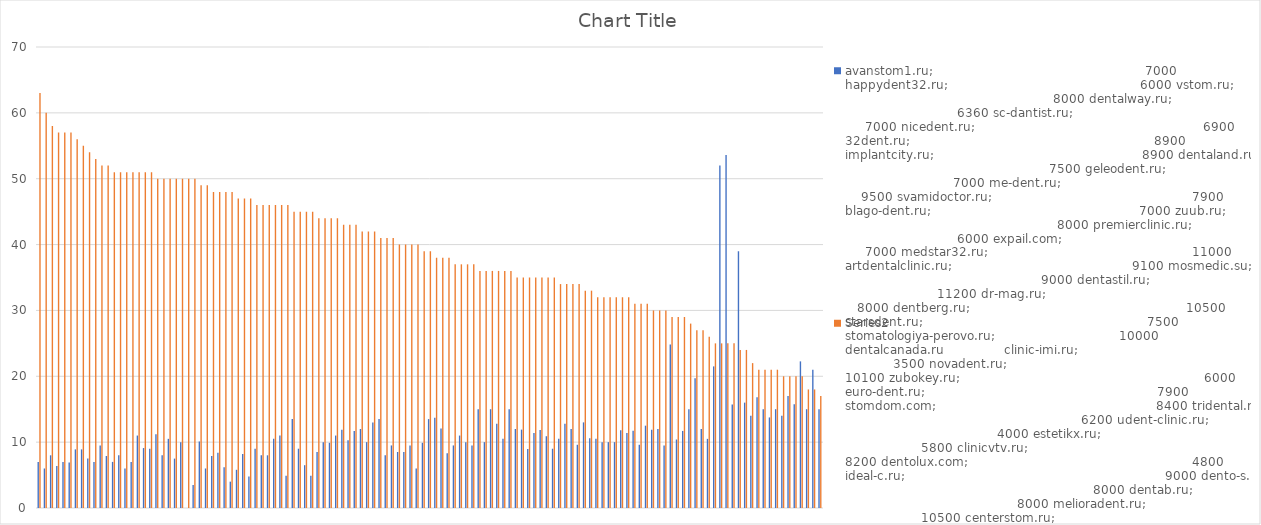
| Category | avanstom1.ru;                                                     7000 | Series 1 |
|---|---|---|
| 0 | 7 | 63 |
| 1 | 6 | 60 |
| 2 | 8 | 58 |
| 3 | 6.36 | 57 |
| 4 | 7 | 57 |
| 5 | 6.9 | 57 |
| 6 | 8.9 | 56 |
| 7 | 8.9 | 55 |
| 8 | 7.5 | 54 |
| 9 | 7 | 53 |
| 10 | 9.5 | 52 |
| 11 | 7.9 | 52 |
| 12 | 7 | 51 |
| 13 | 8 | 51 |
| 14 | 6 | 51 |
| 15 | 7 | 51 |
| 16 | 11 | 51 |
| 17 | 9.1 | 51 |
| 18 | 9 | 51 |
| 19 | 11.2 | 50 |
| 20 | 8 | 50 |
| 21 | 10.5 | 50 |
| 22 | 7.5 | 50 |
| 23 | 10 | 50 |
| 24 | 0 | 50 |
| 25 | 3.5 | 50 |
| 26 | 10.1 | 49 |
| 27 | 6 | 49 |
| 28 | 7.9 | 48 |
| 29 | 8.4 | 48 |
| 30 | 6.2 | 48 |
| 31 | 4 | 48 |
| 32 | 5.8 | 47 |
| 33 | 8.2 | 47 |
| 34 | 4.8 | 47 |
| 35 | 9 | 46 |
| 36 | 8 | 46 |
| 37 | 8 | 46 |
| 38 | 10.5 | 46 |
| 39 | 11 | 46 |
| 40 | 4.9 | 46 |
| 41 | 13.5 | 45 |
| 42 | 9 | 45 |
| 43 | 6.5 | 45 |
| 44 | 4.9 | 45 |
| 45 | 8.5 | 44 |
| 46 | 10 | 44 |
| 47 | 9.9 | 44 |
| 48 | 11 | 44 |
| 49 | 11.9 | 43 |
| 50 | 10.3 | 43 |
| 51 | 11.7 | 43 |
| 52 | 12 | 42 |
| 53 | 10 | 42 |
| 54 | 13 | 42 |
| 55 | 13.5 | 41 |
| 56 | 8 | 41 |
| 57 | 9.5 | 41 |
| 58 | 8.5 | 40 |
| 59 | 8.5 | 40 |
| 60 | 9.5 | 40 |
| 61 | 6 | 40 |
| 62 | 9.9 | 39 |
| 63 | 13.5 | 39 |
| 64 | 13.7 | 38 |
| 65 | 12.09 | 38 |
| 66 | 8.3 | 38 |
| 67 | 9.5 | 37 |
| 68 | 11 | 37 |
| 69 | 10 | 37 |
| 70 | 9.5 | 37 |
| 71 | 15 | 36 |
| 72 | 10 | 36 |
| 73 | 15 | 36 |
| 74 | 12.8 | 36 |
| 75 | 10.5 | 36 |
| 76 | 15 | 36 |
| 77 | 12 | 35 |
| 78 | 11.9 | 35 |
| 79 | 8.95 | 35 |
| 80 | 11.4 | 35 |
| 81 | 11.85 | 35 |
| 82 | 10.9 | 35 |
| 83 | 9 | 35 |
| 84 | 10.5 | 34 |
| 85 | 12.8 | 34 |
| 86 | 12 | 34 |
| 87 | 9.6 | 34 |
| 88 | 13 | 33 |
| 89 | 10.6 | 33 |
| 90 | 10.5 | 32 |
| 91 | 10 | 32 |
| 92 | 10 | 32 |
| 93 | 10 | 32 |
| 94 | 11.81 | 32 |
| 95 | 11.4 | 32 |
| 96 | 11.748 | 31 |
| 97 | 9.6 | 31 |
| 98 | 12.5 | 31 |
| 99 | 11.9 | 30 |
| 100 | 12 | 30 |
| 101 | 9.5 | 30 |
| 102 | 24.833 | 29 |
| 103 | 10.4 | 29 |
| 104 | 11.7 | 29 |
| 105 | 15 | 28 |
| 106 | 19.7 | 27 |
| 107 | 12 | 27 |
| 108 | 10.5 | 26 |
| 109 | 21.5 | 25 |
| 110 | 52 | 25 |
| 111 | 53.615 | 25 |
| 112 | 15.7 | 25 |
| 113 | 38.99 | 24 |
| 114 | 16 | 24 |
| 115 | 14 | 22 |
| 116 | 16.8 | 21 |
| 117 | 15 | 21 |
| 118 | 13.75 | 21 |
| 119 | 15 | 21 |
| 120 | 14 | 20 |
| 121 | 17 | 20 |
| 122 | 15.75 | 20 |
| 123 | 22.264 | 20 |
| 124 | 15 | 18 |
| 125 | 21 | 18 |
| 126 | 15 | 17 |